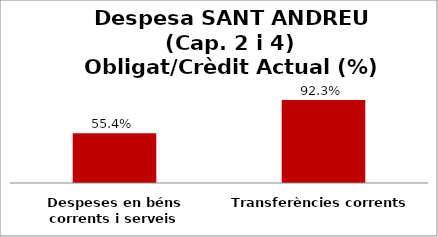
| Category | Series 0 |
|---|---|
| Despeses en béns corrents i serveis | 0.554 |
| Transferències corrents | 0.923 |